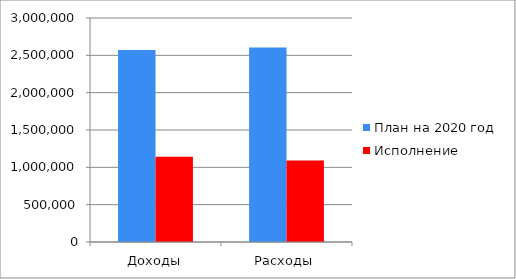
| Category | План на 2020 год | Исполнение |
|---|---|---|
| Доходы | 2572026 | 1140537 |
| Расходы | 2605403 | 1092916 |